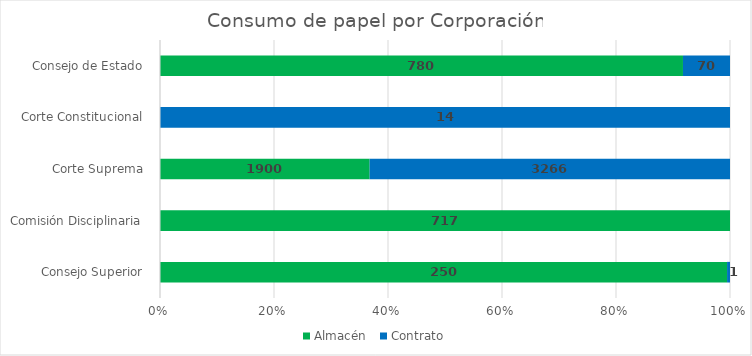
| Category | Almacén  | Contrato |
|---|---|---|
| Consejo Superior  | 250 | 1.3 |
| Comisión Disciplinaria  | 717 | 0 |
| Corte Suprema  | 1900 | 3265.74 |
| Corte Constitucional  | 0 | 14.34 |
| Consejo de Estado  | 780 | 70.14 |